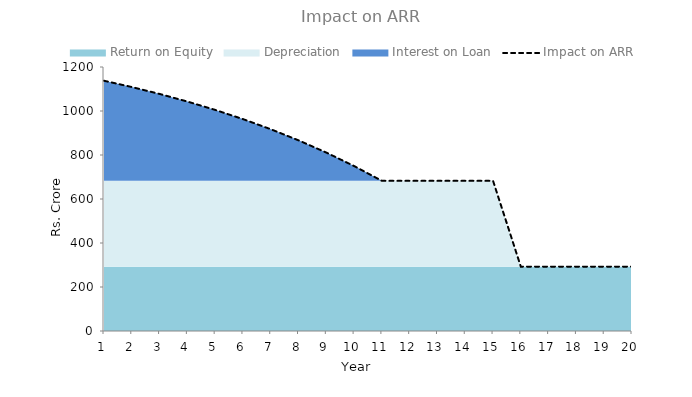
| Category | Impact on ARR  |
|---|---|
| 0 | 1137.5 |
| 1 | 1108.951 |
| 2 | 1077.547 |
| 3 | 1043.002 |
| 4 | 1005.003 |
| 5 | 963.205 |
| 6 | 917.226 |
| 7 | 866.649 |
| 8 | 811.015 |
| 9 | 749.817 |
| 10 | 682.5 |
| 11 | 682.5 |
| 12 | 682.5 |
| 13 | 682.5 |
| 14 | 682.5 |
| 15 | 292.5 |
| 16 | 292.5 |
| 17 | 292.5 |
| 18 | 292.5 |
| 19 | 292.5 |